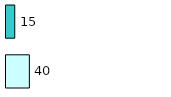
| Category | Series 0 | Series 1 |
|---|---|---|
| 0 | 40 | 15 |